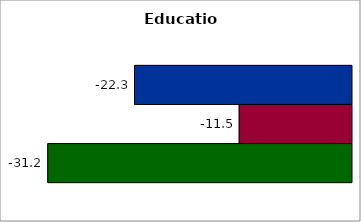
| Category | 50 states and D.C. | SREB states | State |
|---|---|---|---|
| 0 | -22.27 | -11.527 | -31.174 |